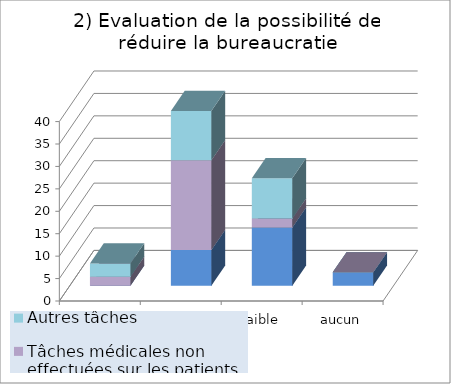
| Category | Tâches médicales effectuées sur les patients | Tâches médicales non effectuées sur les patients | Autres tâches |
|---|---|---|---|
| élevé | 0 | 2 | 3 |
| moyen | 8 | 20 | 11 |
| faible | 13 | 2 | 9 |
| aucun | 3 | 0 | 0 |